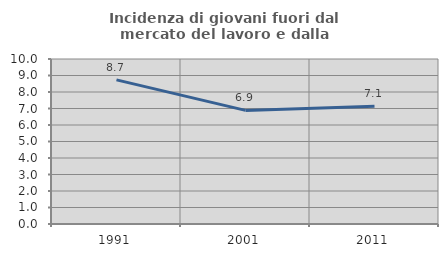
| Category | Incidenza di giovani fuori dal mercato del lavoro e dalla formazione  |
|---|---|
| 1991.0 | 8.733 |
| 2001.0 | 6.885 |
| 2011.0 | 7.14 |